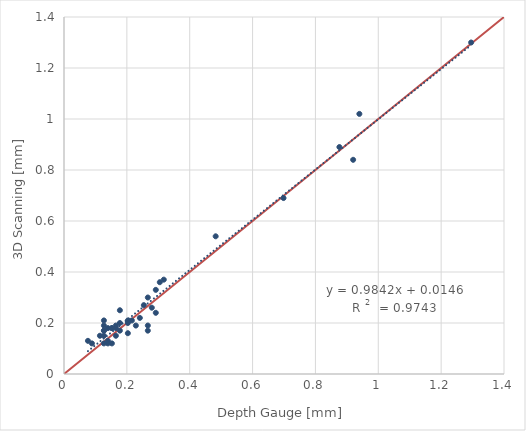
| Category | Ideal |
|---|---|
| 0.0 | 0 |
| 1.4 | 1.4 |